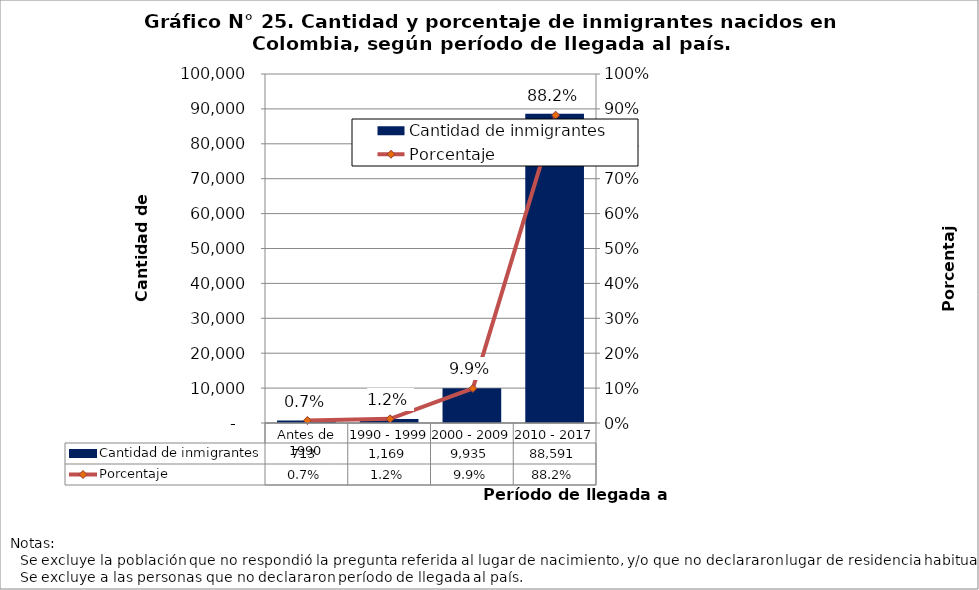
| Category | Cantidad de inmigrantes |
|---|---|
| Antes de 1990 | 713 |
| 1990 - 1999 | 1169 |
| 2000 - 2009 | 9935 |
| 2010 - 2017 | 88591 |